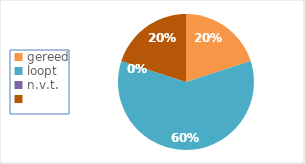
| Category | Series 0 |
|---|---|
| gereed | 1 |
| loopt | 3 |
| n.v.t. | 0 |
|   | 1 |